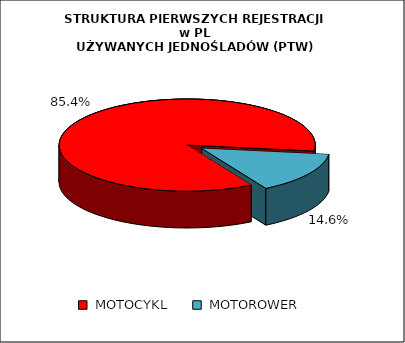
| Category | RAZEM |
|---|---|
|  MOTOCYKL  | 0.854 |
|  MOTOROWER  | 0.146 |